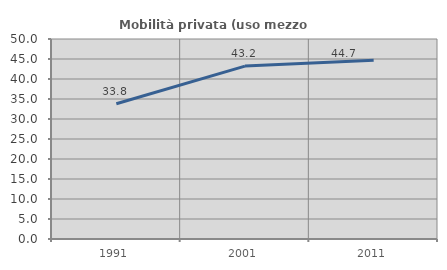
| Category | Mobilità privata (uso mezzo privato) |
|---|---|
| 1991.0 | 33.828 |
| 2001.0 | 43.228 |
| 2011.0 | 44.687 |